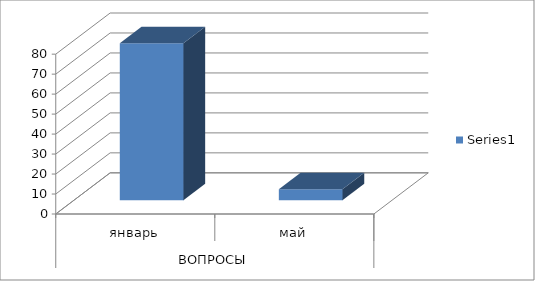
| Category | Series 0 |
|---|---|
| 0 | 78.571 |
| 1 | 5.5 |